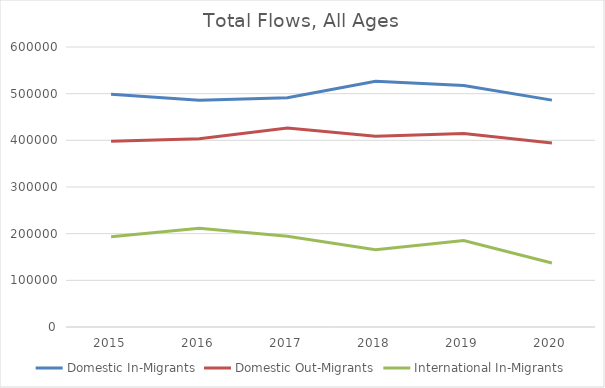
| Category | Domestic In-Migrants | Domestic Out-Migrants | International In-Migrants |
|---|---|---|---|
| 2015 | 499005 | 398278 | 193546 |
| 2016 | 485727 | 403317 | 211745 |
| 2017 | 491385 | 426310 | 194304 |
| 2018 | 526395 | 408785 | 165779 |
| 2019 | 517683 | 414855 | 185077 |
| 2020 | 486193 | 394108 | 137213 |